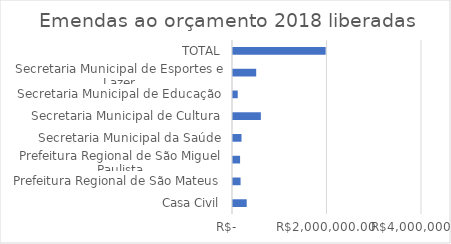
| Category | Series 0 |
|---|---|
| Casa Civil | 290000 |
| Prefeitura Regional de São Mateus | 160000 |
| Prefeitura Regional de São Miguel Paulista | 150000 |
| Secretaria Municipal da Saúde | 180000 |
| Secretaria Municipal de Cultura | 590000 |
| Secretaria Municipal de Educação | 100000 |
| Secretaria Municipal de Esportes e Lazer | 490908 |
| TOTAL | 1960908 |